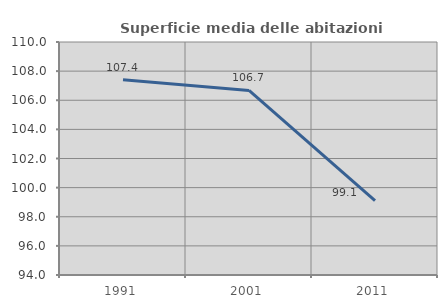
| Category | Superficie media delle abitazioni occupate |
|---|---|
| 1991.0 | 107.403 |
| 2001.0 | 106.675 |
| 2011.0 | 99.11 |